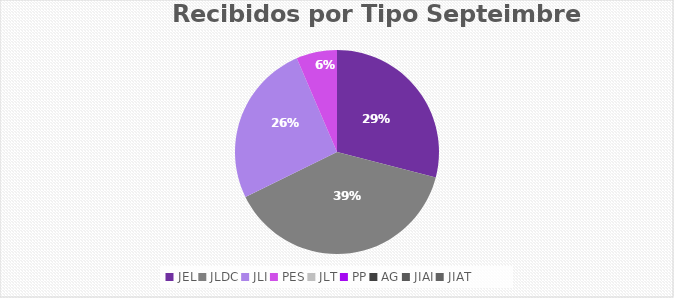
| Category | Series 0 |
|---|---|
| JEL | 9 |
| JLDC | 12 |
| JLI | 8 |
| PES | 2 |
| JLT | 0 |
| PP | 0 |
| AG | 0 |
| JIAI | 0 |
| JIAT | 0 |